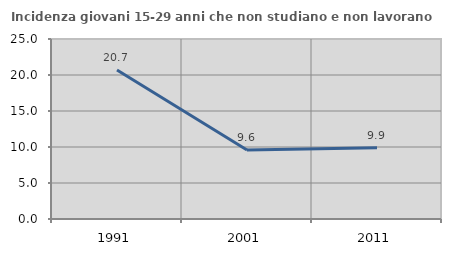
| Category | Incidenza giovani 15-29 anni che non studiano e non lavorano  |
|---|---|
| 1991.0 | 20.69 |
| 2001.0 | 9.574 |
| 2011.0 | 9.901 |